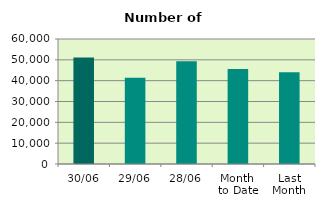
| Category | Series 0 |
|---|---|
| 30/06 | 51106 |
| 29/06 | 41448 |
| 28/06 | 49294 |
| Month 
to Date | 45645.364 |
| Last
Month | 44009.364 |